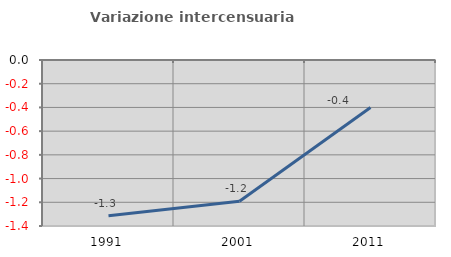
| Category | Variazione intercensuaria annua |
|---|---|
| 1991.0 | -1.313 |
| 2001.0 | -1.191 |
| 2011.0 | -0.4 |